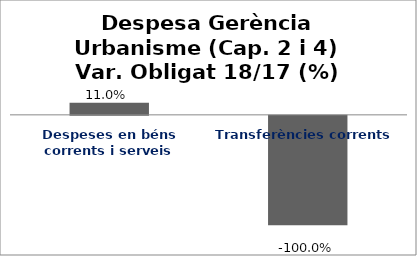
| Category | Series 0 |
|---|---|
| Despeses en béns corrents i serveis | 0.11 |
| Transferències corrents | -1 |